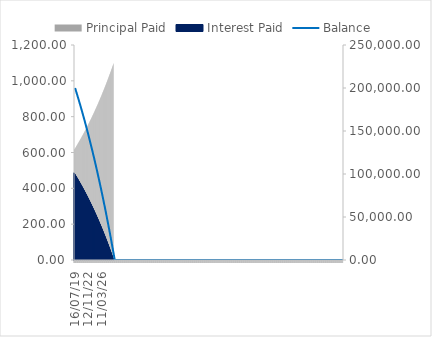
| Category | Principal Paid | Interest Paid |
|---|---|---|
| 16/07/19 | 614.738 | 486.164 |
| 31/07/19 | 616.232 | 484.67 |
| 15/08/19 | 617.73 | 483.172 |
| 30/08/19 | 619.232 | 481.67 |
| 14/09/19 | 620.737 | 480.165 |
| 29/09/19 | 622.246 | 478.656 |
| 14/10/19 | 623.759 | 477.144 |
| 29/10/19 | 625.275 | 475.627 |
| 13/11/19 | 626.795 | 474.107 |
| 28/11/19 | 628.318 | 472.584 |
| 13/12/19 | 629.846 | 471.056 |
| 28/12/19 | 631.377 | 469.525 |
| 12/01/20 | 632.912 | 467.991 |
| 27/01/20 | 634.45 | 466.452 |
| 11/02/20 | 635.992 | 464.91 |
| 26/02/20 | 637.538 | 463.364 |
| 12/03/20 | 639.088 | 461.814 |
| 27/03/20 | 640.642 | 460.261 |
| 11/04/20 | 642.199 | 458.703 |
| 26/04/20 | 643.76 | 457.142 |
| 11/05/20 | 645.325 | 455.577 |
| 26/05/20 | 646.893 | 454.009 |
| 10/06/20 | 648.466 | 452.436 |
| 25/06/20 | 650.042 | 450.86 |
| 10/07/20 | 651.622 | 449.28 |
| 25/07/20 | 653.206 | 447.696 |
| 09/08/20 | 654.794 | 446.108 |
| 24/08/20 | 656.386 | 444.516 |
| 08/09/20 | 657.981 | 442.921 |
| 23/09/20 | 659.581 | 441.321 |
| 08/10/20 | 661.184 | 439.718 |
| 23/10/20 | 662.791 | 438.111 |
| 07/11/20 | 664.402 | 436.5 |
| 22/11/20 | 666.018 | 434.885 |
| 07/12/20 | 667.636 | 433.266 |
| 22/12/20 | 669.259 | 431.643 |
| 06/01/21 | 670.886 | 430.016 |
| 21/01/21 | 672.517 | 428.385 |
| 05/02/21 | 674.152 | 426.75 |
| 20/02/21 | 675.791 | 425.112 |
| 07/03/21 | 677.433 | 423.469 |
| 22/03/21 | 679.08 | 421.822 |
| 06/04/21 | 680.731 | 420.171 |
| 21/04/21 | 682.385 | 418.517 |
| 06/05/21 | 684.044 | 416.858 |
| 21/05/21 | 685.707 | 415.195 |
| 05/06/21 | 687.374 | 413.528 |
| 20/06/21 | 689.045 | 411.857 |
| 05/07/21 | 690.72 | 410.183 |
| 20/07/21 | 692.399 | 408.504 |
| 04/08/21 | 694.082 | 406.82 |
| 19/08/21 | 695.769 | 405.133 |
| 03/09/21 | 697.46 | 403.442 |
| 18/09/21 | 699.156 | 401.747 |
| 03/10/21 | 700.855 | 400.047 |
| 18/10/21 | 702.559 | 398.343 |
| 02/11/21 | 704.267 | 396.636 |
| 17/11/21 | 705.979 | 394.924 |
| 02/12/21 | 707.695 | 393.208 |
| 17/12/21 | 709.415 | 391.487 |
| 01/01/22 | 711.139 | 389.763 |
| 16/01/22 | 712.868 | 388.034 |
| 31/01/22 | 714.601 | 386.301 |
| 15/02/22 | 716.338 | 384.564 |
| 02/03/22 | 718.079 | 382.823 |
| 17/03/22 | 719.825 | 381.077 |
| 01/04/22 | 721.575 | 379.328 |
| 16/04/22 | 723.329 | 377.574 |
| 01/05/22 | 725.087 | 375.815 |
| 16/05/22 | 726.849 | 374.053 |
| 31/05/22 | 728.616 | 372.286 |
| 15/06/22 | 730.387 | 370.515 |
| 30/06/22 | 732.163 | 368.739 |
| 15/07/22 | 733.943 | 366.96 |
| 30/07/22 | 735.727 | 365.176 |
| 14/08/22 | 737.515 | 363.387 |
| 29/08/22 | 739.308 | 361.594 |
| 13/09/22 | 741.105 | 359.797 |
| 28/09/22 | 742.906 | 357.996 |
| 13/10/22 | 744.712 | 356.19 |
| 28/10/22 | 746.523 | 354.38 |
| 12/11/22 | 748.337 | 352.565 |
| 27/11/22 | 750.156 | 350.746 |
| 12/12/22 | 751.98 | 348.922 |
| 27/12/22 | 753.808 | 347.094 |
| 11/01/23 | 755.64 | 345.262 |
| 26/01/23 | 757.477 | 343.425 |
| 10/02/23 | 759.318 | 341.584 |
| 25/02/23 | 761.164 | 339.738 |
| 12/03/23 | 763.014 | 337.888 |
| 27/03/23 | 764.869 | 336.033 |
| 11/04/23 | 766.728 | 334.174 |
| 26/04/23 | 768.592 | 332.31 |
| 11/05/23 | 770.46 | 330.442 |
| 26/05/23 | 772.333 | 328.569 |
| 10/06/23 | 774.211 | 326.692 |
| 25/06/23 | 776.093 | 324.81 |
| 10/07/23 | 777.979 | 322.923 |
| 25/07/23 | 779.87 | 321.032 |
| 09/08/23 | 781.766 | 319.136 |
| 24/08/23 | 783.666 | 317.236 |
| 08/09/23 | 785.571 | 315.331 |
| 23/09/23 | 787.481 | 313.421 |
| 08/10/23 | 789.395 | 311.507 |
| 23/10/23 | 791.314 | 309.588 |
| 07/11/23 | 793.238 | 307.665 |
| 22/11/23 | 795.166 | 305.736 |
| 07/12/23 | 797.099 | 303.804 |
| 22/12/23 | 799.036 | 301.866 |
| 06/01/24 | 800.979 | 299.924 |
| 21/01/24 | 802.926 | 297.977 |
| 05/02/24 | 804.877 | 296.025 |
| 20/02/24 | 806.834 | 294.068 |
| 06/03/24 | 808.795 | 292.107 |
| 21/03/24 | 810.761 | 290.141 |
| 05/04/24 | 812.732 | 288.17 |
| 20/04/24 | 814.708 | 286.195 |
| 05/05/24 | 816.688 | 284.214 |
| 20/05/24 | 818.673 | 282.229 |
| 04/06/24 | 820.663 | 280.239 |
| 19/06/24 | 822.658 | 278.244 |
| 04/07/24 | 824.658 | 276.244 |
| 19/07/24 | 826.663 | 274.24 |
| 03/08/24 | 828.672 | 272.23 |
| 18/08/24 | 830.686 | 270.216 |
| 02/09/24 | 832.706 | 268.197 |
| 17/09/24 | 834.73 | 266.172 |
| 02/10/24 | 836.759 | 264.143 |
| 17/10/24 | 838.793 | 262.109 |
| 01/11/24 | 840.832 | 260.07 |
| 16/11/24 | 842.876 | 258.027 |
| 01/12/24 | 844.925 | 255.978 |
| 16/12/24 | 846.978 | 253.924 |
| 31/12/24 | 849.037 | 251.865 |
| 15/01/25 | 851.101 | 249.801 |
| 30/01/25 | 853.17 | 247.732 |
| 14/02/25 | 855.244 | 245.658 |
| 01/03/25 | 857.323 | 243.579 |
| 16/03/25 | 859.407 | 241.495 |
| 31/03/25 | 861.496 | 239.406 |
| 15/04/25 | 863.59 | 237.312 |
| 30/04/25 | 865.689 | 235.213 |
| 15/05/25 | 867.794 | 233.109 |
| 30/05/25 | 869.903 | 230.999 |
| 14/06/25 | 872.018 | 228.885 |
| 29/06/25 | 874.137 | 226.765 |
| 14/07/25 | 876.262 | 224.64 |
| 29/07/25 | 878.392 | 222.51 |
| 13/08/25 | 880.528 | 220.375 |
| 28/08/25 | 882.668 | 218.234 |
| 12/09/25 | 884.814 | 216.089 |
| 27/09/25 | 886.964 | 213.938 |
| 12/10/25 | 889.12 | 211.782 |
| 27/10/25 | 891.282 | 209.621 |
| 11/11/25 | 893.448 | 207.454 |
| 26/11/25 | 895.62 | 205.282 |
| 11/12/25 | 897.797 | 203.105 |
| 26/12/25 | 899.98 | 200.923 |
| 10/01/26 | 902.167 | 198.735 |
| 25/01/26 | 904.36 | 196.542 |
| 09/02/26 | 906.559 | 194.344 |
| 24/02/26 | 908.762 | 192.14 |
| 11/03/26 | 910.971 | 189.931 |
| 26/03/26 | 913.186 | 187.717 |
| 10/04/26 | 915.405 | 185.497 |
| 25/04/26 | 917.631 | 183.272 |
| 10/05/26 | 919.861 | 181.041 |
| 25/05/26 | 922.097 | 178.805 |
| 09/06/26 | 924.339 | 176.563 |
| 24/06/26 | 926.586 | 174.317 |
| 09/07/26 | 928.838 | 172.064 |
| 24/07/26 | 931.096 | 169.806 |
| 08/08/26 | 933.359 | 167.543 |
| 23/08/26 | 935.628 | 165.274 |
| 07/09/26 | 937.902 | 163 |
| 22/09/26 | 940.182 | 160.72 |
| 07/10/26 | 942.468 | 158.435 |
| 22/10/26 | 944.759 | 156.144 |
| 06/11/26 | 947.055 | 153.847 |
| 21/11/26 | 949.357 | 151.545 |
| 06/12/26 | 951.665 | 149.237 |
| 21/12/26 | 953.978 | 146.924 |
| 05/01/27 | 956.297 | 144.605 |
| 20/01/27 | 958.622 | 142.28 |
| 04/02/27 | 960.952 | 139.95 |
| 19/02/27 | 963.288 | 137.614 |
| 06/03/27 | 965.63 | 135.273 |
| 21/03/27 | 967.977 | 132.925 |
| 05/04/27 | 970.33 | 130.572 |
| 20/04/27 | 972.688 | 128.214 |
| 05/05/27 | 975.053 | 125.849 |
| 20/05/27 | 977.423 | 123.479 |
| 04/06/27 | 979.799 | 121.103 |
| 19/06/27 | 982.181 | 118.721 |
| 04/07/27 | 984.568 | 116.334 |
| 19/07/27 | 986.962 | 113.941 |
| 03/08/27 | 989.361 | 111.542 |
| 18/08/27 | 991.766 | 109.137 |
| 02/09/27 | 994.176 | 106.726 |
| 17/09/27 | 996.593 | 104.309 |
| 02/10/27 | 999.016 | 101.887 |
| 17/10/27 | 1001.444 | 99.458 |
| 01/11/27 | 1003.878 | 97.024 |
| 16/11/27 | 1006.319 | 94.584 |
| 01/12/27 | 1008.765 | 92.137 |
| 16/12/27 | 1011.217 | 89.685 |
| 31/12/27 | 1013.675 | 87.227 |
| 15/01/28 | 1016.139 | 84.763 |
| 30/01/28 | 1018.609 | 82.293 |
| 14/02/28 | 1021.085 | 79.817 |
| 29/02/28 | 1023.567 | 77.335 |
| 15/03/28 | 1026.055 | 74.847 |
| 30/03/28 | 1028.55 | 72.353 |
| 14/04/28 | 1031.05 | 69.852 |
| 29/04/28 | 1033.556 | 67.346 |
| 14/05/28 | 1036.068 | 64.834 |
| 29/05/28 | 1038.587 | 62.315 |
| 13/06/28 | 1041.112 | 59.791 |
| 28/06/28 | 1043.642 | 57.26 |
| 13/07/28 | 1046.179 | 54.723 |
| 28/07/28 | 1048.722 | 52.18 |
| 12/08/28 | 1051.272 | 49.631 |
| 27/08/28 | 1053.827 | 47.075 |
| 11/09/28 | 1056.389 | 44.513 |
| 26/09/28 | 1058.957 | 41.946 |
| 11/10/28 | 1061.531 | 39.371 |
| 26/10/28 | 1064.111 | 36.791 |
| 10/11/28 | 1066.698 | 34.204 |
| 25/11/28 | 1069.291 | 31.611 |
| 10/12/28 | 1071.89 | 29.012 |
| 25/12/28 | 1074.496 | 26.407 |
| 09/01/29 | 1077.107 | 23.795 |
| 24/01/29 | 1079.726 | 21.176 |
| 08/02/29 | 1082.35 | 18.552 |
| 23/02/29 | 1084.981 | 15.921 |
| 10/03/29 | 1087.619 | 13.283 |
| 25/03/29 | 1090.263 | 10.64 |
| 09/04/29 | 1092.913 | 7.989 |
| 24/04/29 | 1095.569 | 5.333 |
| 09/05/29 | 1098.233 | 2.67 |